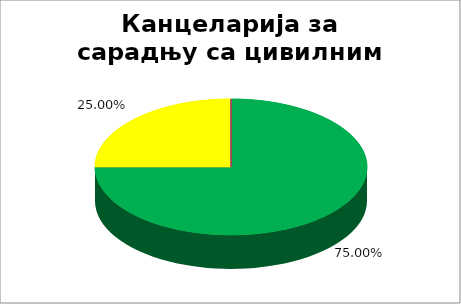
| Category | Канцеларија за сарадњу са цивилним друштвом |
|---|---|
| 0 | 0.75 |
| 1 | 0 |
| 2 | 0.25 |
| 3 | 0 |
| 4 | 0 |